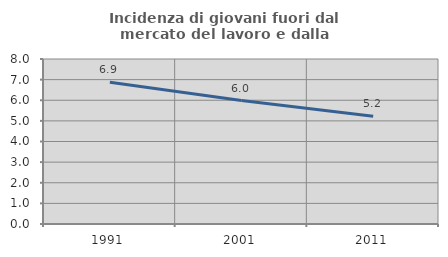
| Category | Incidenza di giovani fuori dal mercato del lavoro e dalla formazione  |
|---|---|
| 1991.0 | 6.876 |
| 2001.0 | 5.985 |
| 2011.0 | 5.22 |